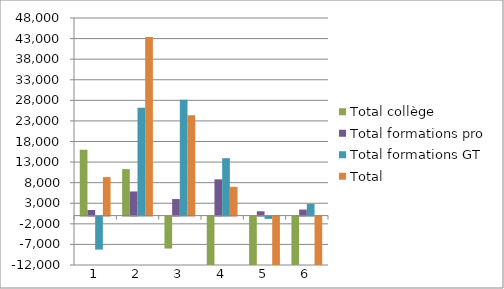
| Category | Total collège | Total formations pro | Total formations GT | Total |
|---|---|---|---|---|
| 0 | 15999 | 1366 | -8011 | 9354 |
| 1 | 11289 | 5861 | 26215 | 43365 |
| 2 | -7763 | 4018 | 28128 | 24383 |
| 3 | -15762 | 8804 | 13941 | 6983 |
| 4 | -17603 | 1044 | -558 | -17117 |
| 5 | -26538 | 1466 | 2835 | -22237 |